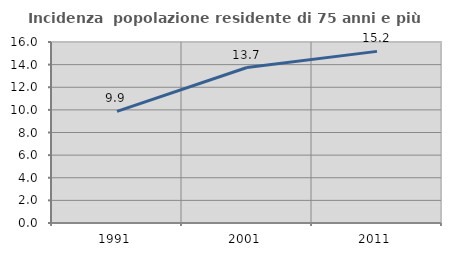
| Category | Incidenza  popolazione residente di 75 anni e più |
|---|---|
| 1991.0 | 9.873 |
| 2001.0 | 13.743 |
| 2011.0 | 15.17 |